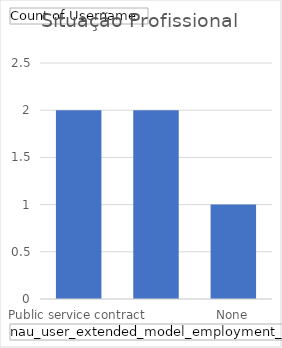
| Category | Total |
|---|---|
|  | 2 |
| Public service contract | 2 |
| None | 1 |